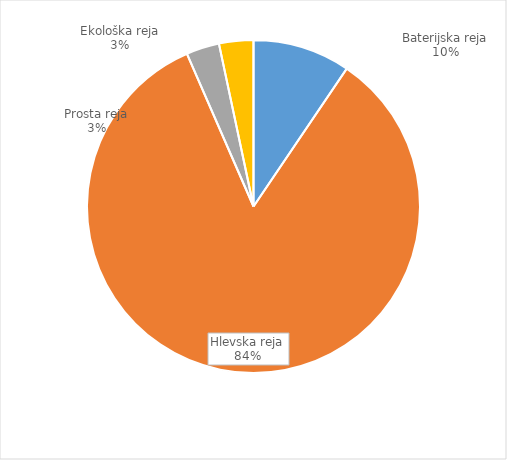
| Category | Količina kosov jajc |
|---|---|
| Baterijska reja | 327300 |
| Hlevska reja | 2904753 |
| Prosta reja | 111180 |
| Ekološka reja | 115200 |